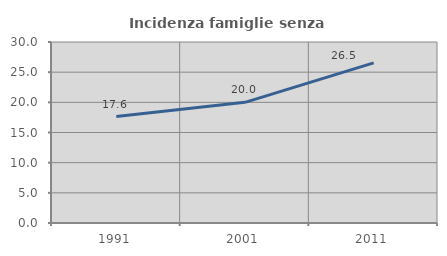
| Category | Incidenza famiglie senza nuclei |
|---|---|
| 1991.0 | 17.634 |
| 2001.0 | 20 |
| 2011.0 | 26.549 |